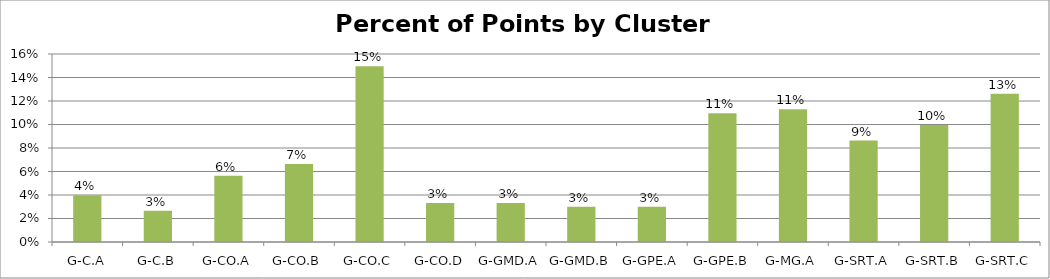
| Category | Percent |
|---|---|
| G-C.A | 0.04 |
| G-C.B | 0.027 |
| G-CO.A | 0.056 |
| G-CO.B | 0.066 |
| G-CO.C | 0.15 |
| G-CO.D | 0.033 |
| G-GMD.A | 0.033 |
| G-GMD.B | 0.03 |
| G-GPE.A | 0.03 |
| G-GPE.B | 0.11 |
| G-MG.A | 0.113 |
| G-SRT.A | 0.086 |
| G-SRT.B | 0.1 |
| G-SRT.C | 0.126 |